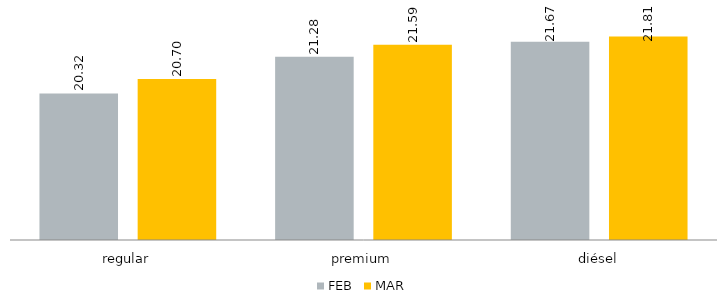
| Category | FEB | MAR |
|---|---|---|
| regular | 20.324 | 20.703 |
| premium | 21.282 | 21.592 |
| diésel | 21.67 | 21.806 |